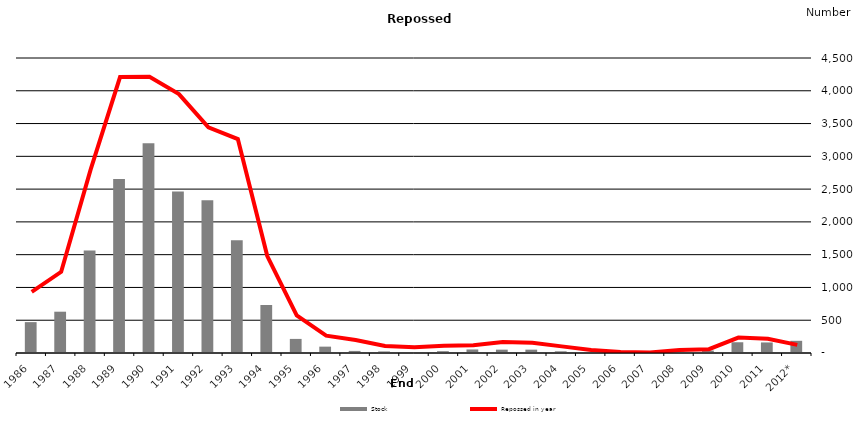
| Category | Stock |
|---|---|
| 1986  | 471 |
| 1987  | 630 |
| 1988  | 1562 |
| 1989  | 2654 |
| 1990  | 3201 |
| 1991  | 2463 |
| 1992  | 2331 |
| 1993  | 1720 |
| 1994  | 732 |
| 1995  | 215 |
| 1996  | 97 |
| 1997  | 32 |
| 1998  | 24 |
| 1999  | 15 |
| 2000  | 28 |
| 2001  | 54 |
| 2002  | 51 |
| 2003  | 51 |
| 2004  | 26 |
| 2005  | 13 |
| 2006  | 1 |
| 2007  | 4 |
| 2008  | 23 |
| 2009  | 37 |
| 2010  | 164 |
| 2011  | 161 |
| 2012* | 186 |